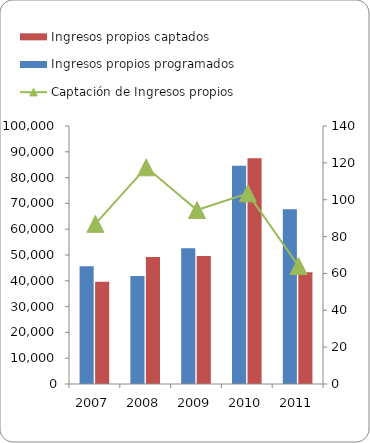
| Category | Ingresos propios programados | Ingresos propios captados  |
|---|---|---|
| 2007 | 45620 | 39641 |
| 2008 | 41871 | 49237 |
| 2009 | 52600 | 49651 |
| 2010 | 84600 | 87525 |
| 2011 | 67737 | 43352 |